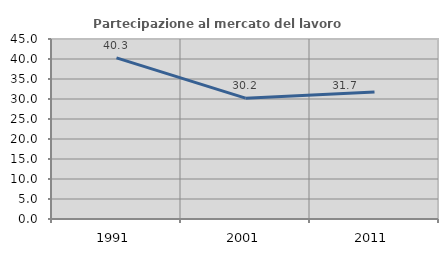
| Category | Partecipazione al mercato del lavoro  femminile |
|---|---|
| 1991.0 | 40.278 |
| 2001.0 | 30.203 |
| 2011.0 | 31.74 |